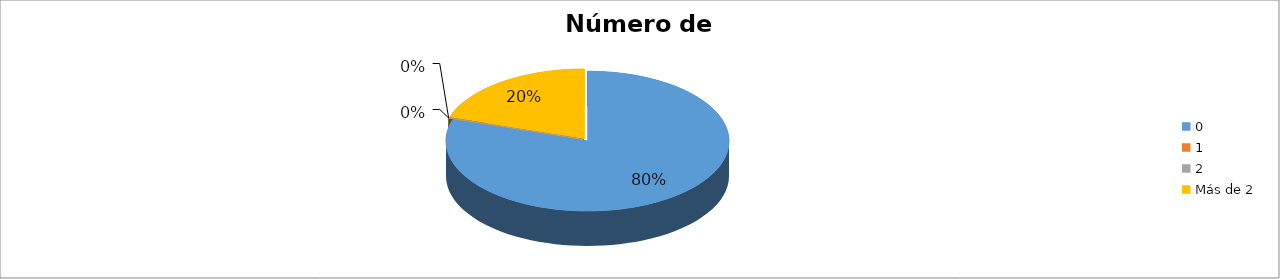
| Category | Series 0 |
|---|---|
| 0 | 0.8 |
| 1 | 0 |
| 2 | 0 |
| Más de 2 | 0.2 |